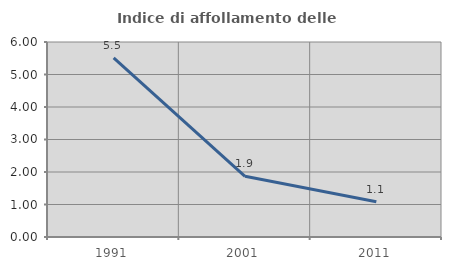
| Category | Indice di affollamento delle abitazioni  |
|---|---|
| 1991.0 | 5.509 |
| 2001.0 | 1.867 |
| 2011.0 | 1.082 |